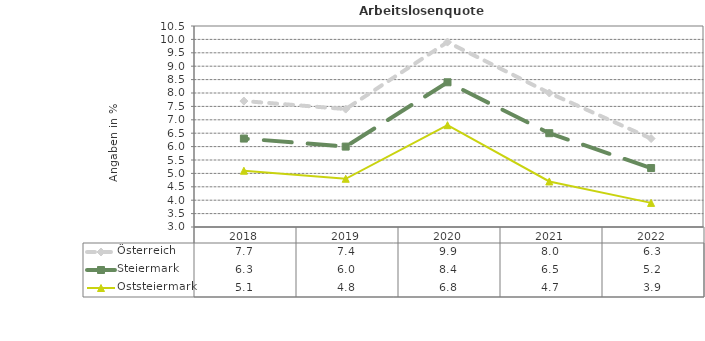
| Category | Österreich | Steiermark | Oststeiermark |
|---|---|---|---|
| 2022.0 | 6.3 | 5.2 | 3.9 |
| 2021.0 | 8 | 6.5 | 4.7 |
| 2020.0 | 9.9 | 8.4 | 6.8 |
| 2019.0 | 7.4 | 6 | 4.8 |
| 2018.0 | 7.7 | 6.3 | 5.1 |